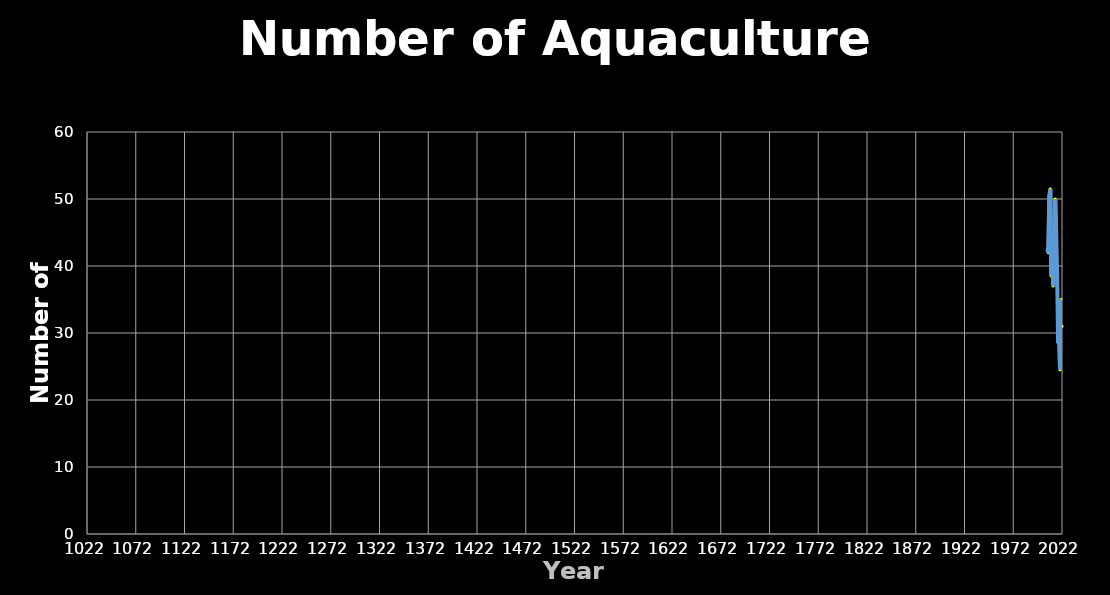
| Category | Series 0 |
|---|---|
| 2007.0 | 42.5 |
| 2008.0 | 42 |
| 2009.0 | 50.5 |
| 2010.0 | 51.5 |
| 2011.0 | 38.5 |
| 2012.0 | 44.5 |
| 2013.0 | 37 |
| 2014.0 | 40.5 |
| 2015.0 | 50 |
| 2016.0 | 45 |
| 2017.0 | 39 |
| 2018.0 | 28.5 |
| 2019.0 | 30.5 |
| 2020.0 | 24.5 |
| 2021.0 | 35 |
| 2022.0 | 31 |